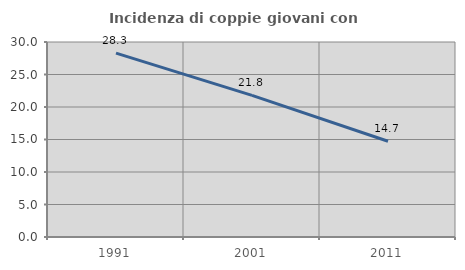
| Category | Incidenza di coppie giovani con figli |
|---|---|
| 1991.0 | 28.295 |
| 2001.0 | 21.793 |
| 2011.0 | 14.736 |